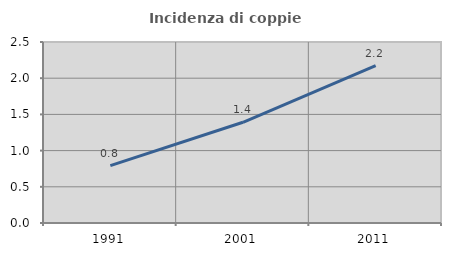
| Category | Incidenza di coppie miste |
|---|---|
| 1991.0 | 0.793 |
| 2001.0 | 1.391 |
| 2011.0 | 2.174 |